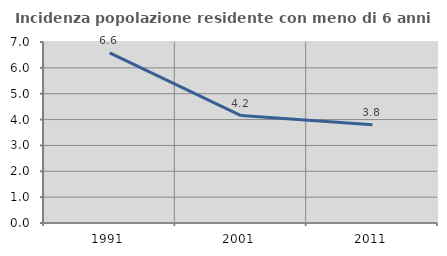
| Category | Incidenza popolazione residente con meno di 6 anni |
|---|---|
| 1991.0 | 6.577 |
| 2001.0 | 4.155 |
| 2011.0 | 3.803 |